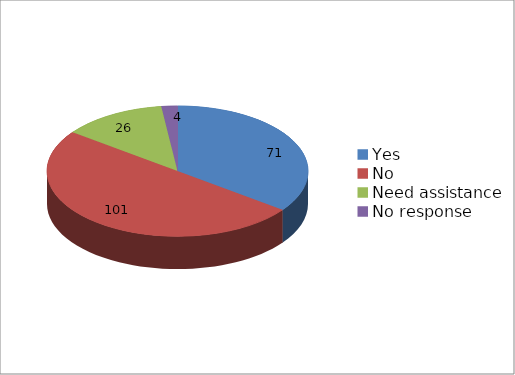
| Category | Series 0 |
|---|---|
| Yes  | 71 |
| No | 101 |
| Need assistance | 26 |
| No response | 4 |